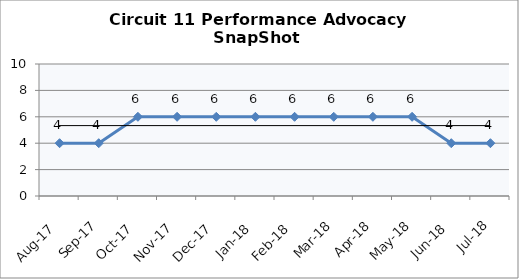
| Category | Circuit 11 |
|---|---|
| Aug-17 | 4 |
| Sep-17 | 4 |
| Oct-17 | 6 |
| Nov-17 | 6 |
| Dec-17 | 6 |
| Jan-18 | 6 |
| Feb-18 | 6 |
| Mar-18 | 6 |
| Apr-18 | 6 |
| May-18 | 6 |
| Jun-18 | 4 |
| Jul-18 | 4 |